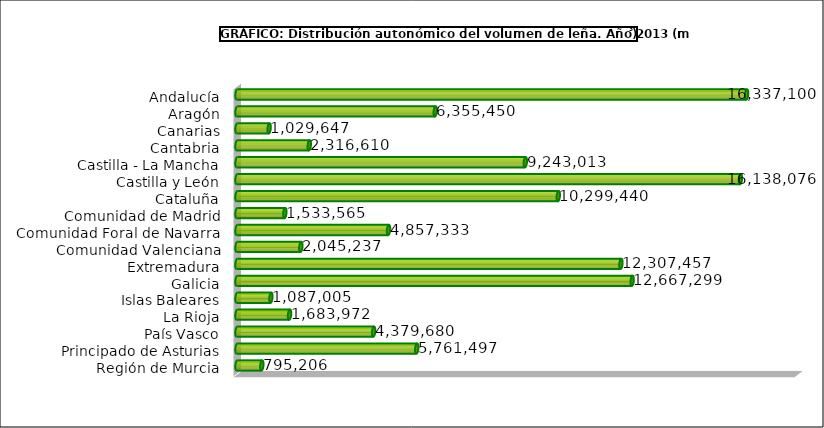
| Category | Series 0 |
|---|---|
| Andalucía | 16337100 |
| Aragón | 6355450 |
| Canarias | 1029647 |
| Cantabria | 2316610 |
| Castilla - La Mancha | 9243013 |
| Castilla y León | 16138076 |
| Cataluña | 10299440 |
| Comunidad de Madrid | 1533565 |
| Comunidad Foral de Navarra | 4857333 |
| Comunidad Valenciana | 2045237 |
| Extremadura | 12307457 |
| Galicia | 12667299 |
| Islas Baleares | 1087005 |
| La Rioja | 1683972 |
| País Vasco | 4379680 |
| Principado de Asturias | 5761497 |
| Región de Murcia | 795206 |